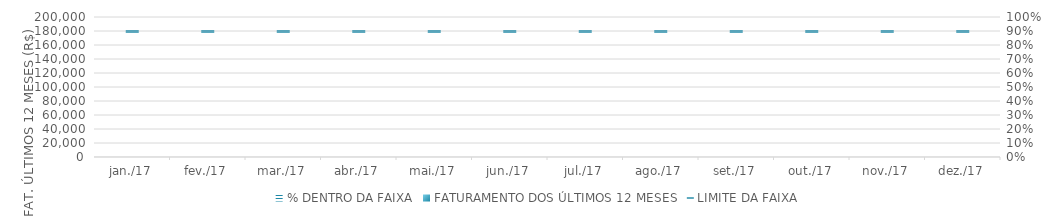
| Category | FATURAMENTO DOS ÚLTIMOS 12 MESES |
|---|---|
| 2017-01-01 | 0 |
| 2017-02-01 | 0 |
| 2017-03-01 | 0 |
| 2017-04-01 | 0 |
| 2017-05-01 | 0 |
| 2017-06-01 | 0 |
| 2017-07-01 | 0 |
| 2017-08-01 | 0 |
| 2017-09-01 | 0 |
| 2017-10-01 | 0 |
| 2017-11-01 | 0 |
| 2017-12-01 | 0 |